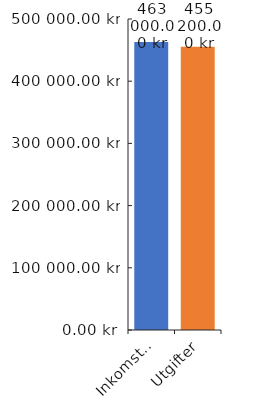
| Category | Diagramdata |
|---|---|
| 0 | 463000 |
| 1 | 455200 |